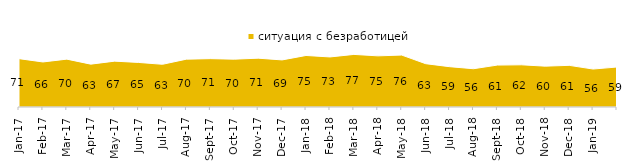
| Category | ситуация с безработицей |
|---|---|
| 2017-01-01 | 70.75 |
| 2017-02-01 | 65.9 |
| 2017-03-01 | 70.05 |
| 2017-04-01 | 62.7 |
| 2017-05-01 | 67.1 |
| 2017-06-01 | 65.2 |
| 2017-07-01 | 62.5 |
| 2017-08-01 | 70 |
| 2017-09-01 | 70.75 |
| 2017-10-01 | 70 |
| 2017-11-01 | 71.45 |
| 2017-12-01 | 68.9 |
| 2018-01-01 | 75.4 |
| 2018-02-01 | 73.25 |
| 2018-03-01 | 76.95 |
| 2018-04-01 | 74.85 |
| 2018-05-01 | 76 |
| 2018-06-01 | 63.4 |
| 2018-07-01 | 59 |
| 2018-08-01 | 56 |
| 2018-09-01 | 61.35 |
| 2018-10-01 | 61.75 |
| 2018-11-01 | 59.78 |
| 2018-12-01 | 60.95 |
| 2019-01-01 | 55.55 |
| nan | 58.5 |